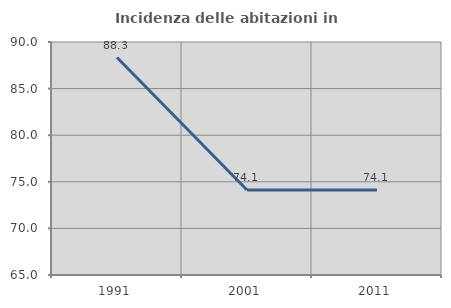
| Category | Incidenza delle abitazioni in proprietà  |
|---|---|
| 1991.0 | 88.333 |
| 2001.0 | 74.118 |
| 2011.0 | 74.118 |